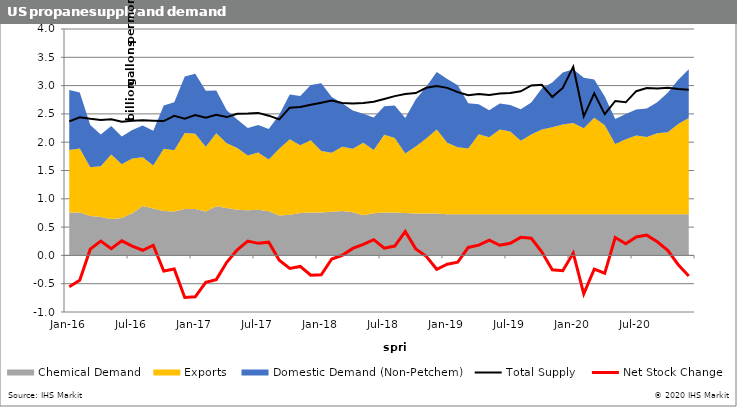
| Category | Total Supply  | Net Stock Change  |
|---|---|---|
| 2016-01-15 | 2.367 | -0.554 |
| 2016-02-15 | 2.439 | -0.44 |
| 2016-03-15 | 2.413 | 0.11 |
| 2016-04-15 | 2.392 | 0.254 |
| 2016-05-15 | 2.404 | 0.119 |
| 2016-06-15 | 2.36 | 0.258 |
| 2016-07-15 | 2.379 | 0.163 |
| 2016-08-15 | 2.388 | 0.091 |
| 2016-09-15 | 2.381 | 0.179 |
| 2016-10-15 | 2.373 | -0.275 |
| 2016-11-15 | 2.466 | -0.24 |
| 2016-12-15 | 2.417 | -0.743 |
| 2017-01-15 | 2.478 | -0.732 |
| 2017-02-15 | 2.431 | -0.477 |
| 2017-03-15 | 2.484 | -0.428 |
| 2017-04-15 | 2.444 | -0.122 |
| 2017-05-15 | 2.502 | 0.099 |
| 2017-06-15 | 2.505 | 0.252 |
| 2017-07-15 | 2.518 | 0.213 |
| 2017-08-15 | 2.469 | 0.234 |
| 2017-09-15 | 2.402 | -0.085 |
| 2017-10-15 | 2.611 | -0.231 |
| 2017-11-15 | 2.623 | -0.194 |
| 2017-12-15 | 2.662 | -0.35 |
| 2018-01-15 | 2.698 | -0.343 |
| 2018-02-15 | 2.737 | -0.063 |
| 2018-03-15 | 2.692 | 0.002 |
| 2018-04-15 | 2.683 | 0.123 |
| 2018-05-15 | 2.694 | 0.194 |
| 2018-06-15 | 2.713 | 0.278 |
| 2018-07-15 | 2.764 | 0.127 |
| 2018-08-15 | 2.814 | 0.165 |
| 2018-09-15 | 2.853 | 0.425 |
| 2018-10-15 | 2.868 | 0.115 |
| 2018-11-15 | 2.962 | -0.017 |
| 2018-12-15 | 2.993 | -0.245 |
| 2019-01-15 | 2.96 | -0.156 |
| 2019-02-15 | 2.885 | -0.119 |
| 2019-03-15 | 2.83 | 0.14 |
| 2019-04-15 | 2.849 | 0.181 |
| 2019-05-15 | 2.836 | 0.271 |
| 2019-06-15 | 2.862 | 0.179 |
| 2019-07-15 | 2.871 | 0.215 |
| 2019-08-15 | 2.9 | 0.319 |
| 2019-09-15 | 3.004 | 0.304 |
| 2019-10-15 | 3.014 | 0.064 |
| 2019-11-15 | 2.799 | -0.255 |
| 2019-12-15 | 2.959 | -0.271 |
| 2020-01-15 | 3.331 | 0.041 |
| 2020-02-15 | 2.457 | -0.681 |
| 2020-03-15 | 2.864 | -0.243 |
| 2020-04-15 | 2.494 | -0.314 |
| 2020-05-15 | 2.728 | 0.317 |
| 2020-06-15 | 2.705 | 0.207 |
| 2020-07-15 | 2.902 | 0.326 |
| 2020-08-15 | 2.956 | 0.358 |
| 2020-09-15 | 2.948 | 0.241 |
| 2020-10-15 | 2.963 | 0.089 |
| 2020-11-15 | 2.938 | -0.165 |
| 2020-12-15 | 2.927 | -0.362 |